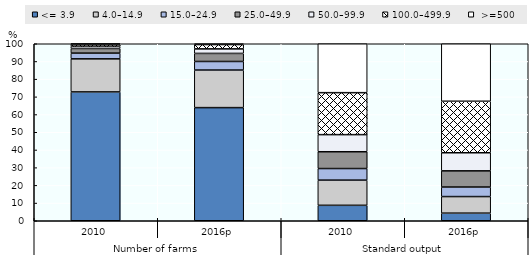
| Category | <= 3.9 | 4.0–14.9 | 15.0–24.9 | 25.0–49.9 | 50.0–99.9 | 100.0–499.9 |  >=500 |
|---|---|---|---|---|---|---|---|
| 0 | 72.784 | 18.69 | 3.245 | 2.616 | 1.337 | 1.142 | 0.186 |
| 1 | 63.915 | 21.229 | 4.84 | 4.554 | 2.567 | 2.441 | 0.453 |
| 2 | 8.723 | 14.232 | 6.545 | 9.49 | 9.667 | 23.709 | 27.633 |
| 3 | 4.294 | 9.365 | 5.391 | 9.149 | 10.218 | 29.101 | 32.481 |